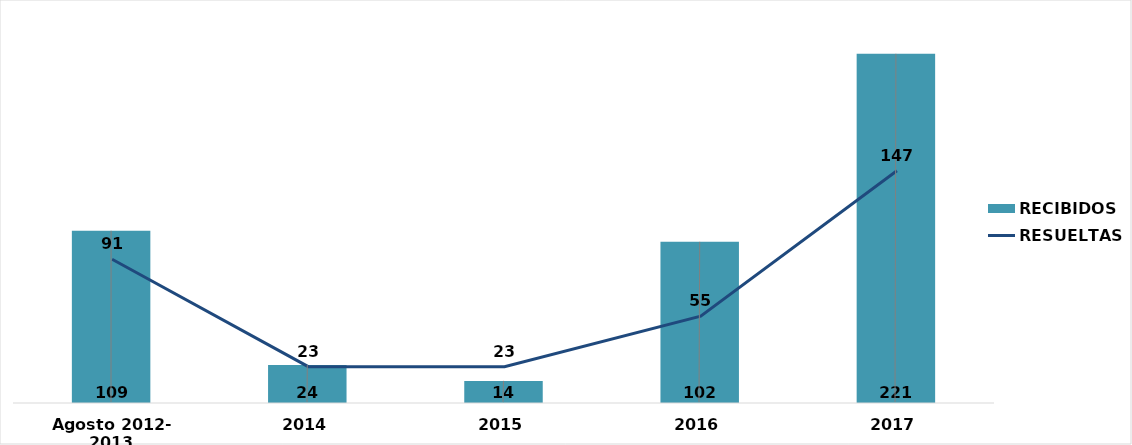
| Category | RECIBIDOS |
|---|---|
| Agosto 2012- 2013 | 109 |
| 2014 | 24 |
| 2015 | 14 |
| 2016 | 102 |
| 2017 | 221 |